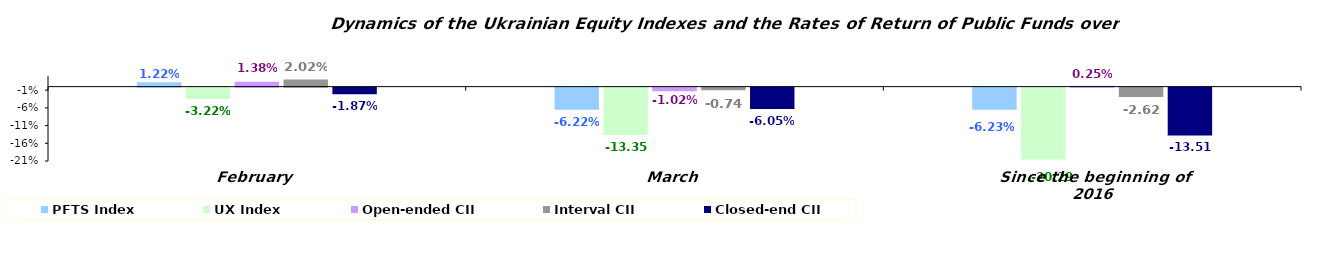
| Category | PFTS Index | UX Index | Open-ended CII | Interval CII | Closed-end CII |
|---|---|---|---|---|---|
| February | 0.012 | -0.032 | 0.014 | 0.02 | -0.019 |
| March | -0.062 | -0.134 | -0.01 | -0.007 | -0.06 |
| Since the beginning of 2016 | -0.062 | -0.203 | 0.003 | -0.026 | -0.135 |